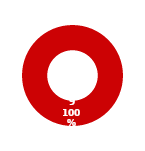
| Category | THREAT |
|---|---|
| MIL 2 Complete | 0 |
| MIL 2 Not Complete | 9 |